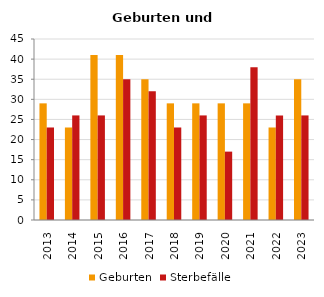
| Category | Geburten | Sterbefälle |
|---|---|---|
| 2013.0 | 29 | 23 |
| 2014.0 | 23 | 26 |
| 2015.0 | 41 | 26 |
| 2016.0 | 41 | 35 |
| 2017.0 | 35 | 32 |
| 2018.0 | 29 | 23 |
| 2019.0 | 29 | 26 |
| 2020.0 | 29 | 17 |
| 2021.0 | 29 | 38 |
| 2022.0 | 23 | 26 |
| 2023.0 | 35 | 26 |